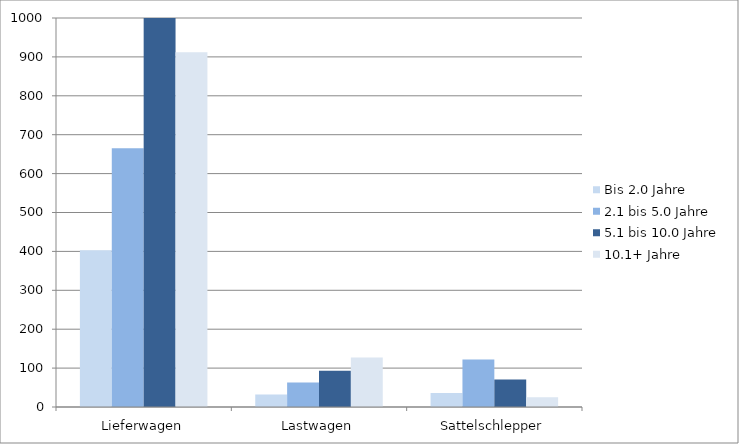
| Category | Bis 2.0 Jahre | 2.1 bis 5.0 Jahre | 5.1 bis 10.0 Jahre | 10.1+ Jahre |
|---|---|---|---|---|
| Lieferwagen | 403 | 665 | 1006 | 912 |
| Lastwagen | 32 | 63 | 93 | 127 |
| Sattelschlepper | 36 | 122 | 71 | 25 |